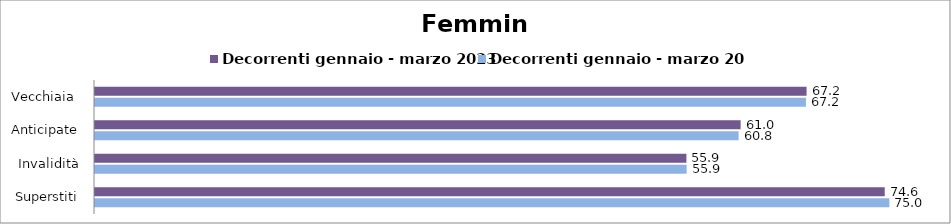
| Category | Decorrenti gennaio - marzo 2023 | Decorrenti gennaio - marzo 2024 |
|---|---|---|
| Vecchiaia  | 67.21 | 67.15 |
| Anticipate | 60.98 | 60.79 |
| Invalidità | 55.86 | 55.88 |
| Superstiti | 74.59 | 75.03 |